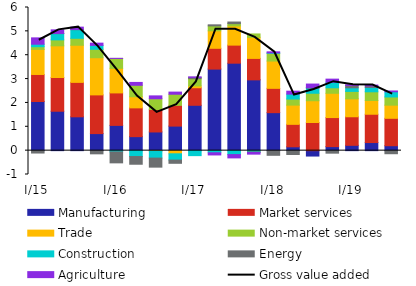
| Category | Manufacturing | Market services | Trade | Non-market services | Construction | Energy | Agriculture |
|---|---|---|---|---|---|---|---|
| I/15 | 2.06 | 1.133 | 1.052 | 0.112 | 0.104 | -0.1 | 0.266 |
| II | 1.652 | 1.414 | 1.328 | 0.249 | 0.262 | 0.009 | 0.149 |
| III | 1.418 | 1.443 | 1.556 | 0.292 | 0.36 | 0.012 | 0.096 |
| IV | 0.715 | 1.622 | 1.558 | 0.353 | 0.163 | -0.134 | 0.095 |
| I/16 | 1.059 | 1.361 | 1.03 | 0.415 | -0.053 | -0.459 | 0.003 |
| II | 0.587 | 1.207 | 0.466 | 0.48 | -0.247 | -0.323 | 0.12 |
| III | 0.783 | 0.942 | -0.02 | 0.451 | -0.292 | -0.379 | 0.119 |
| IV | 1.029 | 0.87 | -0.132 | 0.466 | -0.263 | -0.135 | 0.089 |
| I/17 | 1.901 | 0.736 | 0.075 | 0.302 | -0.209 | 0.056 | 0.021 |
| II | 3.418 | 0.872 | 0.733 | 0.207 | -0.09 | 0.044 | -0.091 |
| III | 3.666 | 0.757 | 0.806 | 0.095 | -0.166 | 0.068 | -0.138 |
| IV | 2.967 | 0.899 | 0.884 | 0.142 | -0.054 | -0.025 | -0.067 |
| I/18 | 1.592 | 1.019 | 1.144 | 0.322 | 0.02 | -0.195 | 0.043 |
| II | 0.161 | 0.941 | 0.806 | 0.255 | 0.206 | -0.163 | 0.123 |
| III | -0.227 | 1.179 | 0.912 | 0.314 | 0.218 | 0.014 | 0.154 |
| IV | 0.169 | 1.218 | 1.017 | 0.23 | 0.234 | -0.106 | 0.129 |
| I/19 | 0.223 | 1.197 | 0.753 | 0.31 | 0.152 | 0.099 | 0.029 |
| II | 0.34 | 1.186 | 0.577 | 0.364 | 0.183 | 0.065 | 0.033 |
| III | 0.207 | 1.149 | 0.552 | 0.343 | 0.218 | -0.129 | 0.034 |